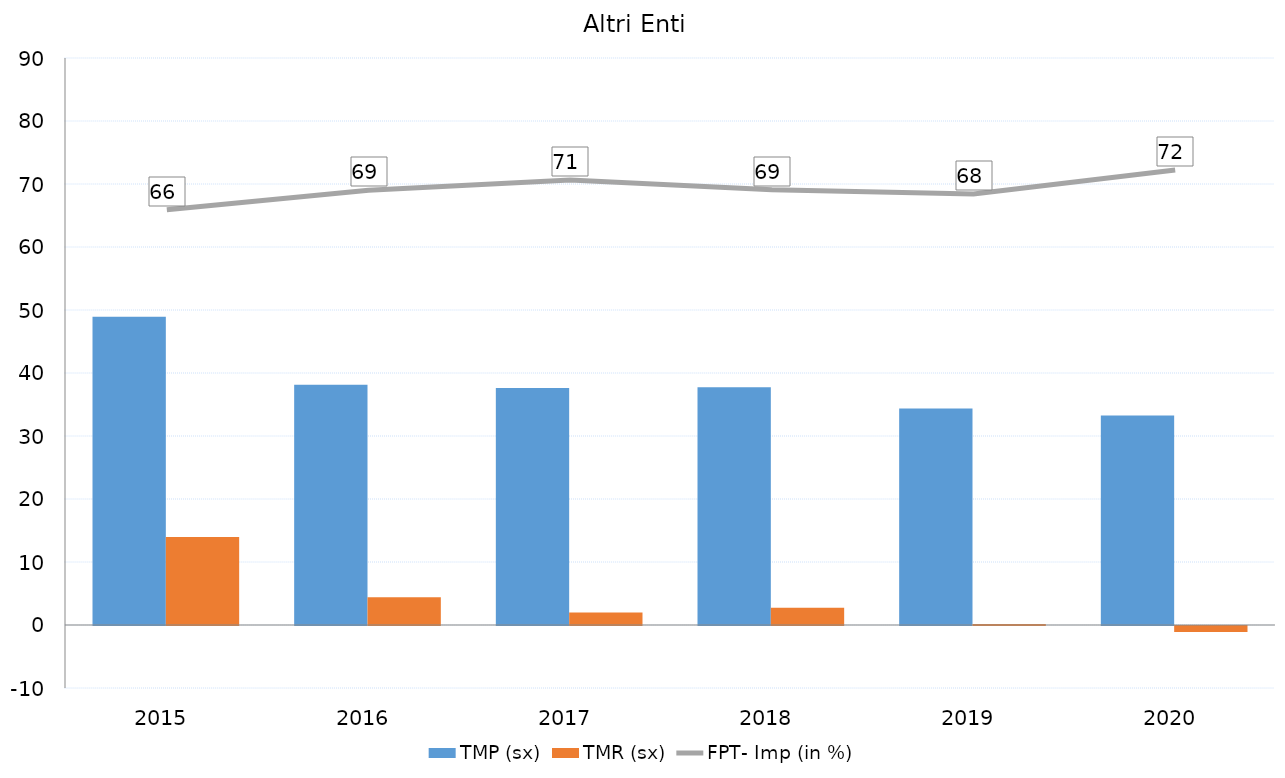
| Category | TMP (sx) | TMR (sx) |
|---|---|---|
| 2015.0 | 48.944 | 13.968 |
| 2016.0 | 38.136 | 4.407 |
| 2017.0 | 37.607 | 1.991 |
| 2018.0 | 37.728 | 2.744 |
| 2019.0 | 34.362 | 0.145 |
| 2020.0 | 33.256 | -0.953 |